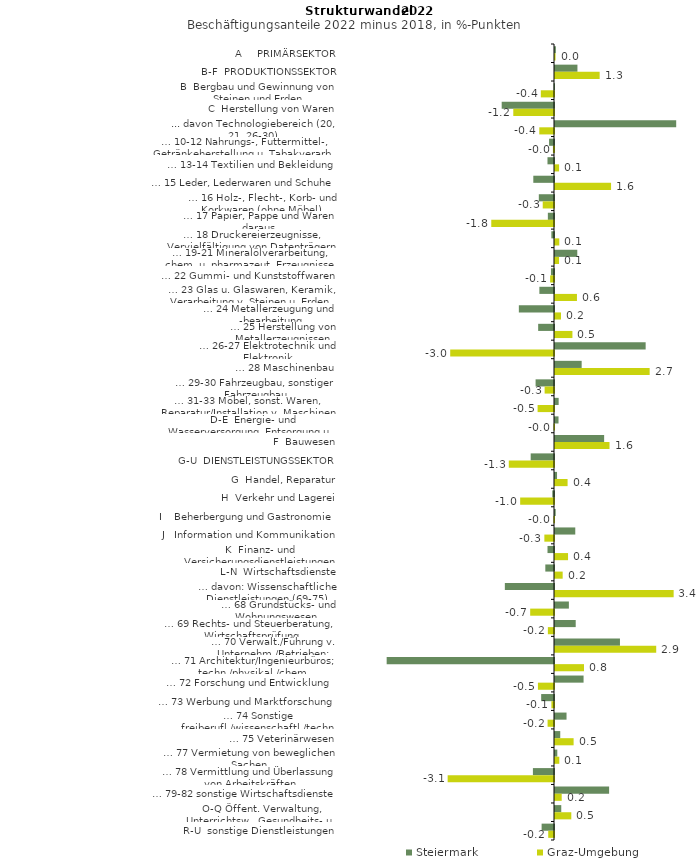
| Category | Steiermark | Graz-Umgebung |
|---|---|---|
| A     PRIMÄRSEKTOR | 0.025 | 0.016 |
| B-F  PRODUKTIONSSEKTOR | 0.65 | 1.294 |
| B  Bergbau und Gewinnung von Steinen und Erden | -0.011 | -0.382 |
| C  Herstellung von Waren | -1.516 | -1.18 |
| ... davon Technologiebereich (20, 21, 26-30) | 3.513 | -0.427 |
| … 10-12 Nahrungs-, Futtermittel-, Getränkeherstellung u. Tabakverarb. | -0.143 | -0.031 |
| … 13-14 Textilien und Bekleidung | -0.189 | 0.119 |
| … 15 Leder, Lederwaren und Schuhe | -0.6 | 1.625 |
| … 16 Holz-, Flecht-, Korb- und Korkwaren (ohne Möbel)  | -0.44 | -0.327 |
| … 17 Papier, Pappe und Waren daraus  | -0.178 | -1.818 |
| … 18 Druckereierzeugnisse, Vervielfältigung von Datenträgern | -0.077 | 0.124 |
| … 19-21 Mineralölverarbeitung, chem. u. pharmazeut. Erzeugnisse | 0.646 | 0.117 |
| … 22 Gummi- und Kunststoffwaren | -0.089 | -0.112 |
| … 23 Glas u. Glaswaren, Keramik, Verarbeitung v. Steinen u. Erden  | -0.424 | 0.637 |
| … 24 Metallerzeugung und -bearbeitung | -1.019 | 0.173 |
| … 25 Herstellung von Metallerzeugnissen  | -0.459 | 0.505 |
| … 26-27 Elektrotechnik und Elektronik | 2.628 | -3.008 |
| … 28 Maschinenbau | 0.773 | 2.744 |
| … 29-30 Fahrzeugbau, sonstiger Fahrzeugbau | -0.534 | -0.272 |
| … 31-33 Möbel, sonst. Waren, Reparatur/Installation v. Maschinen | 0.106 | -0.475 |
| D-E  Energie- und Wasserversorgung, Entsorgung u. Rückgewinnung | 0.102 | -0.013 |
| F  Bauwesen | 1.424 | 1.58 |
| G-U  DIENSTLEISTUNGSSEKTOR | -0.676 | -1.31 |
| G  Handel, Reparatur | 0.059 | 0.365 |
| H  Verkehr und Lagerei | -0.05 | -0.981 |
| I    Beherbergung und Gastronomie | 0.02 | -0.016 |
| J   Information und Kommunikation | 0.588 | -0.28 |
| K  Finanz- und Versicherungsdienstleistungen | -0.188 | 0.378 |
| L-N  Wirtschaftsdienste | -0.252 | 0.222 |
| … davon: Wissenschaftliche Dienstleistungen (69-75) | -1.425 | 3.439 |
| … 68 Grundstücks- und Wohnungswesen  | 0.402 | -0.69 |
| … 69 Rechts- und Steuerberatung, Wirtschaftsprüfung | 0.6 | -0.178 |
| … 70 Verwalt./Führung v. Unternehm./Betrieben; Unternehmensberat. | 1.883 | 2.934 |
| … 71 Architektur/Ingenieurbüros; techn./physikal./chem. Untersuchung | -4.85 | 0.841 |
| … 72 Forschung und Entwicklung  | 0.828 | -0.466 |
| … 73 Werbung und Marktforschung | -0.372 | -0.075 |
| … 74 Sonstige freiberufl./wissenschaftl./techn. Tätigkeiten | 0.334 | -0.186 |
| … 75 Veterinärwesen | 0.152 | 0.539 |
| … 77 Vermietung von beweglichen Sachen  | 0.067 | 0.125 |
| … 78 Vermittlung und Überlassung von Arbeitskräften | -0.611 | -3.082 |
| … 79-82 sonstige Wirtschaftsdienste | 1.569 | 0.194 |
| O-Q Öffent. Verwaltung, Unterrichtsw., Gesundheits- u. Sozialwesen | 0.182 | 0.472 |
| R-U  sonstige Dienstleistungen | -0.359 | -0.167 |